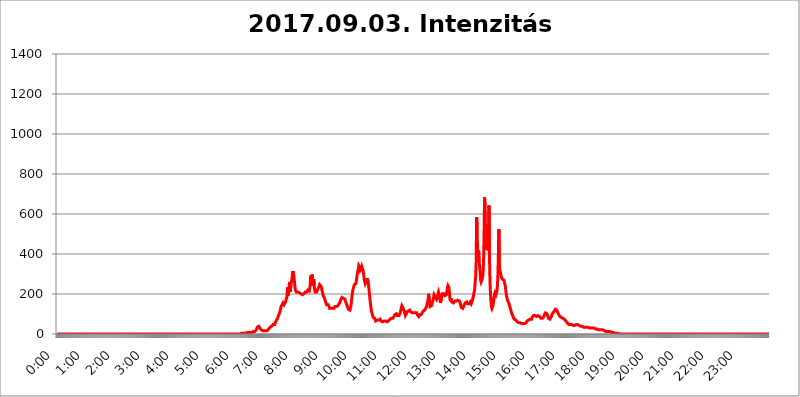
| Category | 2017.09.03. Intenzitás [W/m^2] |
|---|---|
| 0.0 | 0 |
| 0.0006944444444444445 | 0 |
| 0.001388888888888889 | 0 |
| 0.0020833333333333333 | 0 |
| 0.002777777777777778 | 0 |
| 0.003472222222222222 | 0 |
| 0.004166666666666667 | 0 |
| 0.004861111111111111 | 0 |
| 0.005555555555555556 | 0 |
| 0.0062499999999999995 | 0 |
| 0.006944444444444444 | 0 |
| 0.007638888888888889 | 0 |
| 0.008333333333333333 | 0 |
| 0.009027777777777779 | 0 |
| 0.009722222222222222 | 0 |
| 0.010416666666666666 | 0 |
| 0.011111111111111112 | 0 |
| 0.011805555555555555 | 0 |
| 0.012499999999999999 | 0 |
| 0.013194444444444444 | 0 |
| 0.013888888888888888 | 0 |
| 0.014583333333333332 | 0 |
| 0.015277777777777777 | 0 |
| 0.015972222222222224 | 0 |
| 0.016666666666666666 | 0 |
| 0.017361111111111112 | 0 |
| 0.018055555555555557 | 0 |
| 0.01875 | 0 |
| 0.019444444444444445 | 0 |
| 0.02013888888888889 | 0 |
| 0.020833333333333332 | 0 |
| 0.02152777777777778 | 0 |
| 0.022222222222222223 | 0 |
| 0.02291666666666667 | 0 |
| 0.02361111111111111 | 0 |
| 0.024305555555555556 | 0 |
| 0.024999999999999998 | 0 |
| 0.025694444444444447 | 0 |
| 0.02638888888888889 | 0 |
| 0.027083333333333334 | 0 |
| 0.027777777777777776 | 0 |
| 0.02847222222222222 | 0 |
| 0.029166666666666664 | 0 |
| 0.029861111111111113 | 0 |
| 0.030555555555555555 | 0 |
| 0.03125 | 0 |
| 0.03194444444444445 | 0 |
| 0.03263888888888889 | 0 |
| 0.03333333333333333 | 0 |
| 0.034027777777777775 | 0 |
| 0.034722222222222224 | 0 |
| 0.035416666666666666 | 0 |
| 0.036111111111111115 | 0 |
| 0.03680555555555556 | 0 |
| 0.0375 | 0 |
| 0.03819444444444444 | 0 |
| 0.03888888888888889 | 0 |
| 0.03958333333333333 | 0 |
| 0.04027777777777778 | 0 |
| 0.04097222222222222 | 0 |
| 0.041666666666666664 | 0 |
| 0.042361111111111106 | 0 |
| 0.04305555555555556 | 0 |
| 0.043750000000000004 | 0 |
| 0.044444444444444446 | 0 |
| 0.04513888888888889 | 0 |
| 0.04583333333333334 | 0 |
| 0.04652777777777778 | 0 |
| 0.04722222222222222 | 0 |
| 0.04791666666666666 | 0 |
| 0.04861111111111111 | 0 |
| 0.049305555555555554 | 0 |
| 0.049999999999999996 | 0 |
| 0.05069444444444445 | 0 |
| 0.051388888888888894 | 0 |
| 0.052083333333333336 | 0 |
| 0.05277777777777778 | 0 |
| 0.05347222222222222 | 0 |
| 0.05416666666666667 | 0 |
| 0.05486111111111111 | 0 |
| 0.05555555555555555 | 0 |
| 0.05625 | 0 |
| 0.05694444444444444 | 0 |
| 0.057638888888888885 | 0 |
| 0.05833333333333333 | 0 |
| 0.05902777777777778 | 0 |
| 0.059722222222222225 | 0 |
| 0.06041666666666667 | 0 |
| 0.061111111111111116 | 0 |
| 0.06180555555555556 | 0 |
| 0.0625 | 0 |
| 0.06319444444444444 | 0 |
| 0.06388888888888888 | 0 |
| 0.06458333333333334 | 0 |
| 0.06527777777777778 | 0 |
| 0.06597222222222222 | 0 |
| 0.06666666666666667 | 0 |
| 0.06736111111111111 | 0 |
| 0.06805555555555555 | 0 |
| 0.06874999999999999 | 0 |
| 0.06944444444444443 | 0 |
| 0.07013888888888889 | 0 |
| 0.07083333333333333 | 0 |
| 0.07152777777777779 | 0 |
| 0.07222222222222223 | 0 |
| 0.07291666666666667 | 0 |
| 0.07361111111111111 | 0 |
| 0.07430555555555556 | 0 |
| 0.075 | 0 |
| 0.07569444444444444 | 0 |
| 0.0763888888888889 | 0 |
| 0.07708333333333334 | 0 |
| 0.07777777777777778 | 0 |
| 0.07847222222222222 | 0 |
| 0.07916666666666666 | 0 |
| 0.0798611111111111 | 0 |
| 0.08055555555555556 | 0 |
| 0.08125 | 0 |
| 0.08194444444444444 | 0 |
| 0.08263888888888889 | 0 |
| 0.08333333333333333 | 0 |
| 0.08402777777777777 | 0 |
| 0.08472222222222221 | 0 |
| 0.08541666666666665 | 0 |
| 0.08611111111111112 | 0 |
| 0.08680555555555557 | 0 |
| 0.08750000000000001 | 0 |
| 0.08819444444444445 | 0 |
| 0.08888888888888889 | 0 |
| 0.08958333333333333 | 0 |
| 0.09027777777777778 | 0 |
| 0.09097222222222222 | 0 |
| 0.09166666666666667 | 0 |
| 0.09236111111111112 | 0 |
| 0.09305555555555556 | 0 |
| 0.09375 | 0 |
| 0.09444444444444444 | 0 |
| 0.09513888888888888 | 0 |
| 0.09583333333333333 | 0 |
| 0.09652777777777777 | 0 |
| 0.09722222222222222 | 0 |
| 0.09791666666666667 | 0 |
| 0.09861111111111111 | 0 |
| 0.09930555555555555 | 0 |
| 0.09999999999999999 | 0 |
| 0.10069444444444443 | 0 |
| 0.1013888888888889 | 0 |
| 0.10208333333333335 | 0 |
| 0.10277777777777779 | 0 |
| 0.10347222222222223 | 0 |
| 0.10416666666666667 | 0 |
| 0.10486111111111111 | 0 |
| 0.10555555555555556 | 0 |
| 0.10625 | 0 |
| 0.10694444444444444 | 0 |
| 0.1076388888888889 | 0 |
| 0.10833333333333334 | 0 |
| 0.10902777777777778 | 0 |
| 0.10972222222222222 | 0 |
| 0.1111111111111111 | 0 |
| 0.11180555555555556 | 0 |
| 0.11180555555555556 | 0 |
| 0.1125 | 0 |
| 0.11319444444444444 | 0 |
| 0.11388888888888889 | 0 |
| 0.11458333333333333 | 0 |
| 0.11527777777777777 | 0 |
| 0.11597222222222221 | 0 |
| 0.11666666666666665 | 0 |
| 0.1173611111111111 | 0 |
| 0.11805555555555557 | 0 |
| 0.11944444444444445 | 0 |
| 0.12013888888888889 | 0 |
| 0.12083333333333333 | 0 |
| 0.12152777777777778 | 0 |
| 0.12222222222222223 | 0 |
| 0.12291666666666667 | 0 |
| 0.12291666666666667 | 0 |
| 0.12361111111111112 | 0 |
| 0.12430555555555556 | 0 |
| 0.125 | 0 |
| 0.12569444444444444 | 0 |
| 0.12638888888888888 | 0 |
| 0.12708333333333333 | 0 |
| 0.16875 | 0 |
| 0.12847222222222224 | 0 |
| 0.12916666666666668 | 0 |
| 0.12986111111111112 | 0 |
| 0.13055555555555556 | 0 |
| 0.13125 | 0 |
| 0.13194444444444445 | 0 |
| 0.1326388888888889 | 0 |
| 0.13333333333333333 | 0 |
| 0.13402777777777777 | 0 |
| 0.13402777777777777 | 0 |
| 0.13472222222222222 | 0 |
| 0.13541666666666666 | 0 |
| 0.1361111111111111 | 0 |
| 0.13749999999999998 | 0 |
| 0.13819444444444443 | 0 |
| 0.1388888888888889 | 0 |
| 0.13958333333333334 | 0 |
| 0.14027777777777778 | 0 |
| 0.14097222222222222 | 0 |
| 0.14166666666666666 | 0 |
| 0.1423611111111111 | 0 |
| 0.14305555555555557 | 0 |
| 0.14375000000000002 | 0 |
| 0.14444444444444446 | 0 |
| 0.1451388888888889 | 0 |
| 0.1451388888888889 | 0 |
| 0.14652777777777778 | 0 |
| 0.14722222222222223 | 0 |
| 0.14791666666666667 | 0 |
| 0.1486111111111111 | 0 |
| 0.14930555555555555 | 0 |
| 0.15 | 0 |
| 0.15069444444444444 | 0 |
| 0.15138888888888888 | 0 |
| 0.15208333333333332 | 0 |
| 0.15277777777777776 | 0 |
| 0.15347222222222223 | 0 |
| 0.15416666666666667 | 0 |
| 0.15486111111111112 | 0 |
| 0.15555555555555556 | 0 |
| 0.15625 | 0 |
| 0.15694444444444444 | 0 |
| 0.15763888888888888 | 0 |
| 0.15833333333333333 | 0 |
| 0.15902777777777777 | 0 |
| 0.15972222222222224 | 0 |
| 0.16041666666666668 | 0 |
| 0.16111111111111112 | 0 |
| 0.16180555555555556 | 0 |
| 0.1625 | 0 |
| 0.16319444444444445 | 0 |
| 0.1638888888888889 | 0 |
| 0.16458333333333333 | 0 |
| 0.16527777777777777 | 0 |
| 0.16597222222222222 | 0 |
| 0.16666666666666666 | 0 |
| 0.1673611111111111 | 0 |
| 0.16805555555555554 | 0 |
| 0.16874999999999998 | 0 |
| 0.16944444444444443 | 0 |
| 0.17013888888888887 | 0 |
| 0.1708333333333333 | 0 |
| 0.17152777777777775 | 0 |
| 0.17222222222222225 | 0 |
| 0.1729166666666667 | 0 |
| 0.17361111111111113 | 0 |
| 0.17430555555555557 | 0 |
| 0.17500000000000002 | 0 |
| 0.17569444444444446 | 0 |
| 0.1763888888888889 | 0 |
| 0.17708333333333334 | 0 |
| 0.17777777777777778 | 0 |
| 0.17847222222222223 | 0 |
| 0.17916666666666667 | 0 |
| 0.1798611111111111 | 0 |
| 0.18055555555555555 | 0 |
| 0.18125 | 0 |
| 0.18194444444444444 | 0 |
| 0.1826388888888889 | 0 |
| 0.18333333333333335 | 0 |
| 0.1840277777777778 | 0 |
| 0.18472222222222223 | 0 |
| 0.18541666666666667 | 0 |
| 0.18611111111111112 | 0 |
| 0.18680555555555556 | 0 |
| 0.1875 | 0 |
| 0.18819444444444444 | 0 |
| 0.18888888888888888 | 0 |
| 0.18958333333333333 | 0 |
| 0.19027777777777777 | 0 |
| 0.1909722222222222 | 0 |
| 0.19166666666666665 | 0 |
| 0.19236111111111112 | 0 |
| 0.19305555555555554 | 0 |
| 0.19375 | 0 |
| 0.19444444444444445 | 0 |
| 0.1951388888888889 | 0 |
| 0.19583333333333333 | 0 |
| 0.19652777777777777 | 0 |
| 0.19722222222222222 | 0 |
| 0.19791666666666666 | 0 |
| 0.1986111111111111 | 0 |
| 0.19930555555555554 | 0 |
| 0.19999999999999998 | 0 |
| 0.20069444444444443 | 0 |
| 0.20138888888888887 | 0 |
| 0.2020833333333333 | 0 |
| 0.2027777777777778 | 0 |
| 0.2034722222222222 | 0 |
| 0.2041666666666667 | 0 |
| 0.20486111111111113 | 0 |
| 0.20555555555555557 | 0 |
| 0.20625000000000002 | 0 |
| 0.20694444444444446 | 0 |
| 0.2076388888888889 | 0 |
| 0.20833333333333334 | 0 |
| 0.20902777777777778 | 0 |
| 0.20972222222222223 | 0 |
| 0.21041666666666667 | 0 |
| 0.2111111111111111 | 0 |
| 0.21180555555555555 | 0 |
| 0.2125 | 0 |
| 0.21319444444444444 | 0 |
| 0.2138888888888889 | 0 |
| 0.21458333333333335 | 0 |
| 0.2152777777777778 | 0 |
| 0.21597222222222223 | 0 |
| 0.21666666666666667 | 0 |
| 0.21736111111111112 | 0 |
| 0.21805555555555556 | 0 |
| 0.21875 | 0 |
| 0.21944444444444444 | 0 |
| 0.22013888888888888 | 0 |
| 0.22083333333333333 | 0 |
| 0.22152777777777777 | 0 |
| 0.2222222222222222 | 0 |
| 0.22291666666666665 | 0 |
| 0.2236111111111111 | 0 |
| 0.22430555555555556 | 0 |
| 0.225 | 0 |
| 0.22569444444444445 | 0 |
| 0.2263888888888889 | 0 |
| 0.22708333333333333 | 0 |
| 0.22777777777777777 | 0 |
| 0.22847222222222222 | 0 |
| 0.22916666666666666 | 0 |
| 0.2298611111111111 | 0 |
| 0.23055555555555554 | 0 |
| 0.23124999999999998 | 0 |
| 0.23194444444444443 | 0 |
| 0.23263888888888887 | 0 |
| 0.2333333333333333 | 0 |
| 0.2340277777777778 | 0 |
| 0.2347222222222222 | 0 |
| 0.2354166666666667 | 0 |
| 0.23611111111111113 | 0 |
| 0.23680555555555557 | 0 |
| 0.23750000000000002 | 0 |
| 0.23819444444444446 | 0 |
| 0.2388888888888889 | 0 |
| 0.23958333333333334 | 0 |
| 0.24027777777777778 | 0 |
| 0.24097222222222223 | 0 |
| 0.24166666666666667 | 0 |
| 0.2423611111111111 | 0 |
| 0.24305555555555555 | 0 |
| 0.24375 | 0 |
| 0.24444444444444446 | 0 |
| 0.24513888888888888 | 0 |
| 0.24583333333333335 | 0 |
| 0.2465277777777778 | 0 |
| 0.24722222222222223 | 0 |
| 0.24791666666666667 | 0 |
| 0.24861111111111112 | 0 |
| 0.24930555555555556 | 0 |
| 0.25 | 0 |
| 0.25069444444444444 | 0 |
| 0.2513888888888889 | 0 |
| 0.2520833333333333 | 0 |
| 0.25277777777777777 | 0 |
| 0.2534722222222222 | 0 |
| 0.25416666666666665 | 0 |
| 0.2548611111111111 | 0 |
| 0.2555555555555556 | 3.525 |
| 0.25625000000000003 | 0 |
| 0.2569444444444445 | 3.525 |
| 0.2576388888888889 | 0 |
| 0.25833333333333336 | 3.525 |
| 0.2590277777777778 | 3.525 |
| 0.25972222222222224 | 3.525 |
| 0.2604166666666667 | 3.525 |
| 0.2611111111111111 | 3.525 |
| 0.26180555555555557 | 3.525 |
| 0.2625 | 3.525 |
| 0.26319444444444445 | 3.525 |
| 0.2638888888888889 | 3.525 |
| 0.26458333333333334 | 3.525 |
| 0.2652777777777778 | 7.887 |
| 0.2659722222222222 | 7.887 |
| 0.26666666666666666 | 7.887 |
| 0.2673611111111111 | 7.887 |
| 0.26805555555555555 | 7.887 |
| 0.26875 | 7.887 |
| 0.26944444444444443 | 7.887 |
| 0.2701388888888889 | 7.887 |
| 0.2708333333333333 | 7.887 |
| 0.27152777777777776 | 7.887 |
| 0.2722222222222222 | 7.887 |
| 0.27291666666666664 | 7.887 |
| 0.2736111111111111 | 7.887 |
| 0.2743055555555555 | 12.257 |
| 0.27499999999999997 | 12.257 |
| 0.27569444444444446 | 12.257 |
| 0.27638888888888885 | 12.257 |
| 0.27708333333333335 | 12.257 |
| 0.2777777777777778 | 12.257 |
| 0.27847222222222223 | 16.636 |
| 0.2791666666666667 | 21.024 |
| 0.2798611111111111 | 25.419 |
| 0.28055555555555556 | 34.234 |
| 0.28125 | 38.653 |
| 0.28194444444444444 | 38.653 |
| 0.2826388888888889 | 38.653 |
| 0.2833333333333333 | 34.234 |
| 0.28402777777777777 | 29.823 |
| 0.2847222222222222 | 29.823 |
| 0.28541666666666665 | 25.419 |
| 0.28611111111111115 | 21.024 |
| 0.28680555555555554 | 21.024 |
| 0.28750000000000003 | 16.636 |
| 0.2881944444444445 | 16.636 |
| 0.2888888888888889 | 12.257 |
| 0.28958333333333336 | 12.257 |
| 0.2902777777777778 | 16.636 |
| 0.29097222222222224 | 16.636 |
| 0.2916666666666667 | 16.636 |
| 0.2923611111111111 | 16.636 |
| 0.29305555555555557 | 16.636 |
| 0.29375 | 16.636 |
| 0.29444444444444445 | 16.636 |
| 0.2951388888888889 | 21.024 |
| 0.29583333333333334 | 21.024 |
| 0.2965277777777778 | 25.419 |
| 0.2972222222222222 | 25.419 |
| 0.29791666666666666 | 29.823 |
| 0.2986111111111111 | 34.234 |
| 0.29930555555555555 | 38.653 |
| 0.3 | 38.653 |
| 0.30069444444444443 | 38.653 |
| 0.3013888888888889 | 38.653 |
| 0.3020833333333333 | 43.079 |
| 0.30277777777777776 | 47.511 |
| 0.3034722222222222 | 43.079 |
| 0.30416666666666664 | 43.079 |
| 0.3048611111111111 | 47.511 |
| 0.3055555555555555 | 51.951 |
| 0.30624999999999997 | 60.85 |
| 0.3069444444444444 | 65.31 |
| 0.3076388888888889 | 69.775 |
| 0.30833333333333335 | 74.246 |
| 0.3090277777777778 | 78.722 |
| 0.30972222222222223 | 83.205 |
| 0.3104166666666667 | 92.184 |
| 0.3111111111111111 | 96.682 |
| 0.31180555555555556 | 105.69 |
| 0.3125 | 114.716 |
| 0.31319444444444444 | 123.758 |
| 0.3138888888888889 | 137.347 |
| 0.3145833333333333 | 141.884 |
| 0.31527777777777777 | 146.423 |
| 0.3159722222222222 | 146.423 |
| 0.31666666666666665 | 155.509 |
| 0.31736111111111115 | 155.509 |
| 0.31805555555555554 | 146.423 |
| 0.31875000000000003 | 146.423 |
| 0.3194444444444445 | 150.964 |
| 0.3201388888888889 | 160.056 |
| 0.32083333333333336 | 169.156 |
| 0.3215277777777778 | 178.264 |
| 0.32222222222222224 | 187.378 |
| 0.3229166666666667 | 233 |
| 0.3236111111111111 | 191.937 |
| 0.32430555555555557 | 201.058 |
| 0.325 | 228.436 |
| 0.32569444444444445 | 260.373 |
| 0.3263888888888889 | 210.182 |
| 0.32708333333333334 | 210.182 |
| 0.3277777777777778 | 246.689 |
| 0.3284722222222222 | 242.127 |
| 0.32916666666666666 | 274.047 |
| 0.3298611111111111 | 301.354 |
| 0.33055555555555555 | 314.98 |
| 0.33125 | 319.517 |
| 0.33194444444444443 | 287.709 |
| 0.3326388888888889 | 264.932 |
| 0.3333333333333333 | 237.564 |
| 0.3340277777777778 | 219.309 |
| 0.3347222222222222 | 219.309 |
| 0.3354166666666667 | 210.182 |
| 0.3361111111111111 | 210.182 |
| 0.3368055555555556 | 214.746 |
| 0.33749999999999997 | 210.182 |
| 0.33819444444444446 | 210.182 |
| 0.33888888888888885 | 210.182 |
| 0.33958333333333335 | 205.62 |
| 0.34027777777777773 | 205.62 |
| 0.34097222222222223 | 205.62 |
| 0.3416666666666666 | 201.058 |
| 0.3423611111111111 | 205.62 |
| 0.3430555555555555 | 201.058 |
| 0.34375 | 196.497 |
| 0.3444444444444445 | 191.937 |
| 0.3451388888888889 | 191.937 |
| 0.3458333333333334 | 201.058 |
| 0.34652777777777777 | 205.62 |
| 0.34722222222222227 | 205.62 |
| 0.34791666666666665 | 210.182 |
| 0.34861111111111115 | 205.62 |
| 0.34930555555555554 | 210.182 |
| 0.35000000000000003 | 210.182 |
| 0.3506944444444444 | 214.746 |
| 0.3513888888888889 | 219.309 |
| 0.3520833333333333 | 219.309 |
| 0.3527777777777778 | 214.746 |
| 0.3534722222222222 | 214.746 |
| 0.3541666666666667 | 219.309 |
| 0.3548611111111111 | 246.689 |
| 0.35555555555555557 | 292.259 |
| 0.35625 | 269.49 |
| 0.35694444444444445 | 255.813 |
| 0.3576388888888889 | 296.808 |
| 0.35833333333333334 | 242.127 |
| 0.3590277777777778 | 264.932 |
| 0.3597222222222222 | 274.047 |
| 0.36041666666666666 | 242.127 |
| 0.3611111111111111 | 219.309 |
| 0.36180555555555555 | 210.182 |
| 0.3625 | 210.182 |
| 0.36319444444444443 | 210.182 |
| 0.3638888888888889 | 210.182 |
| 0.3645833333333333 | 219.309 |
| 0.3652777777777778 | 223.873 |
| 0.3659722222222222 | 228.436 |
| 0.3666666666666667 | 233 |
| 0.3673611111111111 | 237.564 |
| 0.3680555555555556 | 246.689 |
| 0.36874999999999997 | 251.251 |
| 0.36944444444444446 | 251.251 |
| 0.37013888888888885 | 237.564 |
| 0.37083333333333335 | 228.436 |
| 0.37152777777777773 | 214.746 |
| 0.37222222222222223 | 205.62 |
| 0.3729166666666666 | 191.937 |
| 0.3736111111111111 | 187.378 |
| 0.3743055555555555 | 182.82 |
| 0.375 | 178.264 |
| 0.3756944444444445 | 169.156 |
| 0.3763888888888889 | 160.056 |
| 0.3770833333333334 | 155.509 |
| 0.37777777777777777 | 146.423 |
| 0.37847222222222227 | 146.423 |
| 0.37916666666666665 | 146.423 |
| 0.37986111111111115 | 146.423 |
| 0.38055555555555554 | 141.884 |
| 0.38125000000000003 | 137.347 |
| 0.3819444444444444 | 128.284 |
| 0.3826388888888889 | 123.758 |
| 0.3833333333333333 | 123.758 |
| 0.3840277777777778 | 128.284 |
| 0.3847222222222222 | 128.284 |
| 0.3854166666666667 | 128.284 |
| 0.3861111111111111 | 128.284 |
| 0.38680555555555557 | 123.758 |
| 0.3875 | 128.284 |
| 0.38819444444444445 | 128.284 |
| 0.3888888888888889 | 132.814 |
| 0.38958333333333334 | 137.347 |
| 0.3902777777777778 | 137.347 |
| 0.3909722222222222 | 137.347 |
| 0.39166666666666666 | 137.347 |
| 0.3923611111111111 | 137.347 |
| 0.39305555555555555 | 141.884 |
| 0.39375 | 141.884 |
| 0.39444444444444443 | 146.423 |
| 0.3951388888888889 | 150.964 |
| 0.3958333333333333 | 155.509 |
| 0.3965277777777778 | 160.056 |
| 0.3972222222222222 | 164.605 |
| 0.3979166666666667 | 173.709 |
| 0.3986111111111111 | 178.264 |
| 0.3993055555555556 | 182.82 |
| 0.39999999999999997 | 182.82 |
| 0.40069444444444446 | 182.82 |
| 0.40138888888888885 | 178.264 |
| 0.40208333333333335 | 178.264 |
| 0.40277777777777773 | 173.709 |
| 0.40347222222222223 | 173.709 |
| 0.4041666666666666 | 164.605 |
| 0.4048611111111111 | 160.056 |
| 0.4055555555555555 | 150.964 |
| 0.40625 | 146.423 |
| 0.4069444444444445 | 137.347 |
| 0.4076388888888889 | 132.814 |
| 0.4083333333333334 | 123.758 |
| 0.40902777777777777 | 119.235 |
| 0.40972222222222227 | 119.235 |
| 0.41041666666666665 | 119.235 |
| 0.41111111111111115 | 123.758 |
| 0.41180555555555554 | 137.347 |
| 0.41250000000000003 | 160.056 |
| 0.4131944444444444 | 182.82 |
| 0.4138888888888889 | 201.058 |
| 0.4145833333333333 | 219.309 |
| 0.4152777777777778 | 228.436 |
| 0.4159722222222222 | 237.564 |
| 0.4166666666666667 | 246.689 |
| 0.4173611111111111 | 246.689 |
| 0.41805555555555557 | 246.689 |
| 0.41875 | 251.251 |
| 0.41944444444444445 | 264.932 |
| 0.4201388888888889 | 283.156 |
| 0.42083333333333334 | 301.354 |
| 0.4215277777777778 | 314.98 |
| 0.4222222222222222 | 324.052 |
| 0.42291666666666666 | 342.162 |
| 0.4236111111111111 | 346.682 |
| 0.42430555555555555 | 333.113 |
| 0.425 | 319.517 |
| 0.42569444444444443 | 324.052 |
| 0.4263888888888889 | 328.584 |
| 0.4270833333333333 | 337.639 |
| 0.4277777777777778 | 337.639 |
| 0.4284722222222222 | 333.113 |
| 0.4291666666666667 | 314.98 |
| 0.4298611111111111 | 319.517 |
| 0.4305555555555556 | 274.047 |
| 0.43124999999999997 | 260.373 |
| 0.43194444444444446 | 251.251 |
| 0.43263888888888885 | 251.251 |
| 0.43333333333333335 | 255.813 |
| 0.43402777777777773 | 269.49 |
| 0.43472222222222223 | 278.603 |
| 0.4354166666666666 | 274.047 |
| 0.4361111111111111 | 255.813 |
| 0.4368055555555555 | 237.564 |
| 0.4375 | 214.746 |
| 0.4381944444444445 | 187.378 |
| 0.4388888888888889 | 164.605 |
| 0.4395833333333334 | 141.884 |
| 0.44027777777777777 | 123.758 |
| 0.44097222222222227 | 110.201 |
| 0.44166666666666665 | 101.184 |
| 0.44236111111111115 | 92.184 |
| 0.44305555555555554 | 83.205 |
| 0.44375000000000003 | 83.205 |
| 0.4444444444444444 | 83.205 |
| 0.4451388888888889 | 78.722 |
| 0.4458333333333333 | 74.246 |
| 0.4465277777777778 | 65.31 |
| 0.4472222222222222 | 65.31 |
| 0.4479166666666667 | 69.775 |
| 0.4486111111111111 | 69.775 |
| 0.44930555555555557 | 65.31 |
| 0.45 | 65.31 |
| 0.45069444444444445 | 69.775 |
| 0.4513888888888889 | 65.31 |
| 0.45208333333333334 | 65.31 |
| 0.4527777777777778 | 74.246 |
| 0.4534722222222222 | 69.775 |
| 0.45416666666666666 | 65.31 |
| 0.4548611111111111 | 65.31 |
| 0.45555555555555555 | 60.85 |
| 0.45625 | 60.85 |
| 0.45694444444444443 | 65.31 |
| 0.4576388888888889 | 65.31 |
| 0.4583333333333333 | 65.31 |
| 0.4590277777777778 | 65.31 |
| 0.4597222222222222 | 65.31 |
| 0.4604166666666667 | 65.31 |
| 0.4611111111111111 | 60.85 |
| 0.4618055555555556 | 60.85 |
| 0.46249999999999997 | 60.85 |
| 0.46319444444444446 | 60.85 |
| 0.46388888888888885 | 60.85 |
| 0.46458333333333335 | 65.31 |
| 0.46527777777777773 | 65.31 |
| 0.46597222222222223 | 69.775 |
| 0.4666666666666666 | 74.246 |
| 0.4673611111111111 | 74.246 |
| 0.4680555555555555 | 78.722 |
| 0.46875 | 78.722 |
| 0.4694444444444445 | 78.722 |
| 0.4701388888888889 | 78.722 |
| 0.4708333333333334 | 78.722 |
| 0.47152777777777777 | 83.205 |
| 0.47222222222222227 | 87.692 |
| 0.47291666666666665 | 92.184 |
| 0.47361111111111115 | 96.682 |
| 0.47430555555555554 | 101.184 |
| 0.47500000000000003 | 101.184 |
| 0.4756944444444444 | 101.184 |
| 0.4763888888888889 | 96.682 |
| 0.4770833333333333 | 92.184 |
| 0.4777777777777778 | 87.692 |
| 0.4784722222222222 | 87.692 |
| 0.4791666666666667 | 92.184 |
| 0.4798611111111111 | 92.184 |
| 0.48055555555555557 | 101.184 |
| 0.48125 | 110.201 |
| 0.48194444444444445 | 119.235 |
| 0.4826388888888889 | 132.814 |
| 0.48333333333333334 | 141.884 |
| 0.4840277777777778 | 137.347 |
| 0.4847222222222222 | 132.814 |
| 0.48541666666666666 | 128.284 |
| 0.4861111111111111 | 128.284 |
| 0.48680555555555555 | 114.716 |
| 0.4875 | 101.184 |
| 0.48819444444444443 | 92.184 |
| 0.4888888888888889 | 92.184 |
| 0.4895833333333333 | 101.184 |
| 0.4902777777777778 | 110.201 |
| 0.4909722222222222 | 114.716 |
| 0.4916666666666667 | 114.716 |
| 0.4923611111111111 | 114.716 |
| 0.4930555555555556 | 119.235 |
| 0.49374999999999997 | 119.235 |
| 0.49444444444444446 | 119.235 |
| 0.49513888888888885 | 114.716 |
| 0.49583333333333335 | 110.201 |
| 0.49652777777777773 | 110.201 |
| 0.49722222222222223 | 105.69 |
| 0.4979166666666666 | 105.69 |
| 0.4986111111111111 | 110.201 |
| 0.4993055555555555 | 105.69 |
| 0.5 | 105.69 |
| 0.5006944444444444 | 105.69 |
| 0.5013888888888889 | 105.69 |
| 0.5020833333333333 | 105.69 |
| 0.5027777777777778 | 105.69 |
| 0.5034722222222222 | 105.69 |
| 0.5041666666666667 | 105.69 |
| 0.5048611111111111 | 96.682 |
| 0.5055555555555555 | 96.682 |
| 0.50625 | 92.184 |
| 0.5069444444444444 | 87.692 |
| 0.5076388888888889 | 92.184 |
| 0.5083333333333333 | 96.682 |
| 0.5090277777777777 | 96.682 |
| 0.5097222222222222 | 96.682 |
| 0.5104166666666666 | 96.682 |
| 0.5111111111111112 | 101.184 |
| 0.5118055555555555 | 105.69 |
| 0.5125000000000001 | 110.201 |
| 0.5131944444444444 | 114.716 |
| 0.513888888888889 | 119.235 |
| 0.5145833333333333 | 119.235 |
| 0.5152777777777778 | 119.235 |
| 0.5159722222222222 | 123.758 |
| 0.5166666666666667 | 128.284 |
| 0.517361111111111 | 132.814 |
| 0.5180555555555556 | 137.347 |
| 0.5187499999999999 | 150.964 |
| 0.5194444444444445 | 160.056 |
| 0.5201388888888888 | 173.709 |
| 0.5208333333333334 | 201.058 |
| 0.5215277777777778 | 201.058 |
| 0.5222222222222223 | 160.056 |
| 0.5229166666666667 | 137.347 |
| 0.5236111111111111 | 132.814 |
| 0.5243055555555556 | 132.814 |
| 0.525 | 141.884 |
| 0.5256944444444445 | 150.964 |
| 0.5263888888888889 | 155.509 |
| 0.5270833333333333 | 169.156 |
| 0.5277777777777778 | 182.82 |
| 0.5284722222222222 | 196.497 |
| 0.5291666666666667 | 201.058 |
| 0.5298611111111111 | 196.497 |
| 0.5305555555555556 | 182.82 |
| 0.53125 | 178.264 |
| 0.5319444444444444 | 173.709 |
| 0.5326388888888889 | 178.264 |
| 0.5333333333333333 | 187.378 |
| 0.5340277777777778 | 201.058 |
| 0.5347222222222222 | 210.182 |
| 0.5354166666666667 | 205.62 |
| 0.5361111111111111 | 191.937 |
| 0.5368055555555555 | 169.156 |
| 0.5375 | 155.509 |
| 0.5381944444444444 | 160.056 |
| 0.5388888888888889 | 178.264 |
| 0.5395833333333333 | 191.937 |
| 0.5402777777777777 | 201.058 |
| 0.5409722222222222 | 201.058 |
| 0.5416666666666666 | 201.058 |
| 0.5423611111111112 | 201.058 |
| 0.5430555555555555 | 201.058 |
| 0.5437500000000001 | 191.937 |
| 0.5444444444444444 | 187.378 |
| 0.545138888888889 | 187.378 |
| 0.5458333333333333 | 196.497 |
| 0.5465277777777778 | 214.746 |
| 0.5472222222222222 | 233 |
| 0.5479166666666667 | 242.127 |
| 0.548611111111111 | 242.127 |
| 0.5493055555555556 | 233 |
| 0.5499999999999999 | 210.182 |
| 0.5506944444444445 | 178.264 |
| 0.5513888888888888 | 164.605 |
| 0.5520833333333334 | 178.264 |
| 0.5527777777777778 | 178.264 |
| 0.5534722222222223 | 160.056 |
| 0.5541666666666667 | 155.509 |
| 0.5548611111111111 | 155.509 |
| 0.5555555555555556 | 155.509 |
| 0.55625 | 155.509 |
| 0.5569444444444445 | 160.056 |
| 0.5576388888888889 | 164.605 |
| 0.5583333333333333 | 164.605 |
| 0.5590277777777778 | 164.605 |
| 0.5597222222222222 | 164.605 |
| 0.5604166666666667 | 164.605 |
| 0.5611111111111111 | 164.605 |
| 0.5618055555555556 | 169.156 |
| 0.5625 | 173.709 |
| 0.5631944444444444 | 169.156 |
| 0.5638888888888889 | 164.605 |
| 0.5645833333333333 | 164.605 |
| 0.5652777777777778 | 155.509 |
| 0.5659722222222222 | 141.884 |
| 0.5666666666666667 | 132.814 |
| 0.5673611111111111 | 128.284 |
| 0.5680555555555555 | 128.284 |
| 0.56875 | 128.284 |
| 0.5694444444444444 | 132.814 |
| 0.5701388888888889 | 137.347 |
| 0.5708333333333333 | 146.423 |
| 0.5715277777777777 | 150.964 |
| 0.5722222222222222 | 155.509 |
| 0.5729166666666666 | 160.056 |
| 0.5736111111111112 | 160.056 |
| 0.5743055555555555 | 160.056 |
| 0.5750000000000001 | 155.509 |
| 0.5756944444444444 | 150.964 |
| 0.576388888888889 | 146.423 |
| 0.5770833333333333 | 146.423 |
| 0.5777777777777778 | 150.964 |
| 0.5784722222222222 | 155.509 |
| 0.5791666666666667 | 160.056 |
| 0.579861111111111 | 155.509 |
| 0.5805555555555556 | 150.964 |
| 0.5812499999999999 | 155.509 |
| 0.5819444444444445 | 164.605 |
| 0.5826388888888888 | 173.709 |
| 0.5833333333333334 | 182.82 |
| 0.5840277777777778 | 196.497 |
| 0.5847222222222223 | 210.182 |
| 0.5854166666666667 | 223.873 |
| 0.5861111111111111 | 255.813 |
| 0.5868055555555556 | 287.709 |
| 0.5875 | 355.712 |
| 0.5881944444444445 | 583.779 |
| 0.5888888888888889 | 532.513 |
| 0.5895833333333333 | 391.685 |
| 0.5902777777777778 | 382.715 |
| 0.5909722222222222 | 418.492 |
| 0.5916666666666667 | 360.221 |
| 0.5923611111111111 | 342.162 |
| 0.5930555555555556 | 310.44 |
| 0.59375 | 269.49 |
| 0.5944444444444444 | 260.373 |
| 0.5951388888888889 | 264.932 |
| 0.5958333333333333 | 274.047 |
| 0.5965277777777778 | 283.156 |
| 0.5972222222222222 | 305.898 |
| 0.5979166666666667 | 360.221 |
| 0.5986111111111111 | 489.108 |
| 0.5993055555555555 | 683.473 |
| 0.6 | 638.256 |
| 0.6006944444444444 | 497.836 |
| 0.6013888888888889 | 440.702 |
| 0.6020833333333333 | 422.943 |
| 0.6027777777777777 | 427.39 |
| 0.6034722222222222 | 549.704 |
| 0.6041666666666666 | 418.492 |
| 0.6048611111111112 | 528.2 |
| 0.6055555555555555 | 642.4 |
| 0.6062500000000001 | 378.224 |
| 0.6069444444444444 | 260.373 |
| 0.607638888888889 | 201.058 |
| 0.6083333333333333 | 160.056 |
| 0.6090277777777778 | 137.347 |
| 0.6097222222222222 | 128.284 |
| 0.6104166666666667 | 132.814 |
| 0.611111111111111 | 141.884 |
| 0.6118055555555556 | 160.056 |
| 0.6124999999999999 | 178.264 |
| 0.6131944444444445 | 196.497 |
| 0.6138888888888888 | 205.62 |
| 0.6145833333333334 | 210.182 |
| 0.6152777777777778 | 196.497 |
| 0.6159722222222223 | 201.058 |
| 0.6166666666666667 | 214.746 |
| 0.6173611111111111 | 242.127 |
| 0.6180555555555556 | 296.808 |
| 0.61875 | 405.108 |
| 0.6194444444444445 | 523.88 |
| 0.6201388888888889 | 333.113 |
| 0.6208333333333333 | 319.517 |
| 0.6215277777777778 | 305.898 |
| 0.6222222222222222 | 296.808 |
| 0.6229166666666667 | 283.156 |
| 0.6236111111111111 | 278.603 |
| 0.6243055555555556 | 274.047 |
| 0.625 | 269.49 |
| 0.6256944444444444 | 269.49 |
| 0.6263888888888889 | 269.49 |
| 0.6270833333333333 | 260.373 |
| 0.6277777777777778 | 255.813 |
| 0.6284722222222222 | 237.564 |
| 0.6291666666666667 | 214.746 |
| 0.6298611111111111 | 196.497 |
| 0.6305555555555555 | 182.82 |
| 0.63125 | 173.709 |
| 0.6319444444444444 | 164.605 |
| 0.6326388888888889 | 160.056 |
| 0.6333333333333333 | 155.509 |
| 0.6340277777777777 | 146.423 |
| 0.6347222222222222 | 137.347 |
| 0.6354166666666666 | 128.284 |
| 0.6361111111111112 | 119.235 |
| 0.6368055555555555 | 110.201 |
| 0.6375000000000001 | 101.184 |
| 0.6381944444444444 | 96.682 |
| 0.638888888888889 | 92.184 |
| 0.6395833333333333 | 83.205 |
| 0.6402777777777778 | 78.722 |
| 0.6409722222222222 | 74.246 |
| 0.6416666666666667 | 74.246 |
| 0.642361111111111 | 74.246 |
| 0.6430555555555556 | 69.775 |
| 0.6437499999999999 | 65.31 |
| 0.6444444444444445 | 65.31 |
| 0.6451388888888888 | 60.85 |
| 0.6458333333333334 | 56.398 |
| 0.6465277777777778 | 56.398 |
| 0.6472222222222223 | 56.398 |
| 0.6479166666666667 | 56.398 |
| 0.6486111111111111 | 56.398 |
| 0.6493055555555556 | 56.398 |
| 0.65 | 56.398 |
| 0.6506944444444445 | 51.951 |
| 0.6513888888888889 | 51.951 |
| 0.6520833333333333 | 51.951 |
| 0.6527777777777778 | 51.951 |
| 0.6534722222222222 | 51.951 |
| 0.6541666666666667 | 51.951 |
| 0.6548611111111111 | 51.951 |
| 0.6555555555555556 | 51.951 |
| 0.65625 | 47.511 |
| 0.6569444444444444 | 51.951 |
| 0.6576388888888889 | 56.398 |
| 0.6583333333333333 | 60.85 |
| 0.6590277777777778 | 65.31 |
| 0.6597222222222222 | 69.775 |
| 0.6604166666666667 | 69.775 |
| 0.6611111111111111 | 69.775 |
| 0.6618055555555555 | 69.775 |
| 0.6625 | 69.775 |
| 0.6631944444444444 | 74.246 |
| 0.6638888888888889 | 74.246 |
| 0.6645833333333333 | 74.246 |
| 0.6652777777777777 | 74.246 |
| 0.6659722222222222 | 83.205 |
| 0.6666666666666666 | 83.205 |
| 0.6673611111111111 | 87.692 |
| 0.6680555555555556 | 92.184 |
| 0.6687500000000001 | 92.184 |
| 0.6694444444444444 | 92.184 |
| 0.6701388888888888 | 92.184 |
| 0.6708333333333334 | 87.692 |
| 0.6715277777777778 | 87.692 |
| 0.6722222222222222 | 87.692 |
| 0.6729166666666666 | 87.692 |
| 0.6736111111111112 | 92.184 |
| 0.6743055555555556 | 92.184 |
| 0.6749999999999999 | 92.184 |
| 0.6756944444444444 | 92.184 |
| 0.6763888888888889 | 87.692 |
| 0.6770833333333334 | 83.205 |
| 0.6777777777777777 | 83.205 |
| 0.6784722222222223 | 78.722 |
| 0.6791666666666667 | 78.722 |
| 0.6798611111111111 | 78.722 |
| 0.6805555555555555 | 78.722 |
| 0.68125 | 83.205 |
| 0.6819444444444445 | 83.205 |
| 0.6826388888888889 | 87.692 |
| 0.6833333333333332 | 96.682 |
| 0.6840277777777778 | 101.184 |
| 0.6847222222222222 | 105.69 |
| 0.6854166666666667 | 105.69 |
| 0.686111111111111 | 101.184 |
| 0.6868055555555556 | 101.184 |
| 0.6875 | 96.682 |
| 0.6881944444444444 | 87.692 |
| 0.688888888888889 | 78.722 |
| 0.6895833333333333 | 74.246 |
| 0.6902777777777778 | 74.246 |
| 0.6909722222222222 | 74.246 |
| 0.6916666666666668 | 74.246 |
| 0.6923611111111111 | 78.722 |
| 0.6930555555555555 | 87.692 |
| 0.69375 | 96.682 |
| 0.6944444444444445 | 101.184 |
| 0.6951388888888889 | 105.69 |
| 0.6958333333333333 | 110.201 |
| 0.6965277777777777 | 110.201 |
| 0.6972222222222223 | 114.716 |
| 0.6979166666666666 | 119.235 |
| 0.6986111111111111 | 123.758 |
| 0.6993055555555556 | 119.235 |
| 0.7000000000000001 | 119.235 |
| 0.7006944444444444 | 119.235 |
| 0.7013888888888888 | 114.716 |
| 0.7020833333333334 | 105.69 |
| 0.7027777777777778 | 101.184 |
| 0.7034722222222222 | 96.682 |
| 0.7041666666666666 | 92.184 |
| 0.7048611111111112 | 87.692 |
| 0.7055555555555556 | 87.692 |
| 0.7062499999999999 | 87.692 |
| 0.7069444444444444 | 83.205 |
| 0.7076388888888889 | 83.205 |
| 0.7083333333333334 | 78.722 |
| 0.7090277777777777 | 78.722 |
| 0.7097222222222223 | 74.246 |
| 0.7104166666666667 | 74.246 |
| 0.7111111111111111 | 74.246 |
| 0.7118055555555555 | 74.246 |
| 0.7125 | 69.775 |
| 0.7131944444444445 | 65.31 |
| 0.7138888888888889 | 60.85 |
| 0.7145833333333332 | 60.85 |
| 0.7152777777777778 | 56.398 |
| 0.7159722222222222 | 56.398 |
| 0.7166666666666667 | 51.951 |
| 0.717361111111111 | 47.511 |
| 0.7180555555555556 | 47.511 |
| 0.71875 | 47.511 |
| 0.7194444444444444 | 47.511 |
| 0.720138888888889 | 47.511 |
| 0.7208333333333333 | 47.511 |
| 0.7215277777777778 | 47.511 |
| 0.7222222222222222 | 47.511 |
| 0.7229166666666668 | 43.079 |
| 0.7236111111111111 | 43.079 |
| 0.7243055555555555 | 43.079 |
| 0.725 | 43.079 |
| 0.7256944444444445 | 43.079 |
| 0.7263888888888889 | 43.079 |
| 0.7270833333333333 | 43.079 |
| 0.7277777777777777 | 47.511 |
| 0.7284722222222223 | 47.511 |
| 0.7291666666666666 | 47.511 |
| 0.7298611111111111 | 47.511 |
| 0.7305555555555556 | 43.079 |
| 0.7312500000000001 | 43.079 |
| 0.7319444444444444 | 43.079 |
| 0.7326388888888888 | 43.079 |
| 0.7333333333333334 | 43.079 |
| 0.7340277777777778 | 38.653 |
| 0.7347222222222222 | 38.653 |
| 0.7354166666666666 | 38.653 |
| 0.7361111111111112 | 38.653 |
| 0.7368055555555556 | 38.653 |
| 0.7374999999999999 | 34.234 |
| 0.7381944444444444 | 34.234 |
| 0.7388888888888889 | 34.234 |
| 0.7395833333333334 | 34.234 |
| 0.7402777777777777 | 34.234 |
| 0.7409722222222223 | 34.234 |
| 0.7416666666666667 | 34.234 |
| 0.7423611111111111 | 34.234 |
| 0.7430555555555555 | 34.234 |
| 0.74375 | 34.234 |
| 0.7444444444444445 | 34.234 |
| 0.7451388888888889 | 29.823 |
| 0.7458333333333332 | 29.823 |
| 0.7465277777777778 | 29.823 |
| 0.7472222222222222 | 29.823 |
| 0.7479166666666667 | 29.823 |
| 0.748611111111111 | 29.823 |
| 0.7493055555555556 | 29.823 |
| 0.75 | 29.823 |
| 0.7506944444444444 | 29.823 |
| 0.751388888888889 | 29.823 |
| 0.7520833333333333 | 29.823 |
| 0.7527777777777778 | 29.823 |
| 0.7534722222222222 | 25.419 |
| 0.7541666666666668 | 25.419 |
| 0.7548611111111111 | 25.419 |
| 0.7555555555555555 | 25.419 |
| 0.75625 | 25.419 |
| 0.7569444444444445 | 25.419 |
| 0.7576388888888889 | 21.024 |
| 0.7583333333333333 | 21.024 |
| 0.7590277777777777 | 21.024 |
| 0.7597222222222223 | 21.024 |
| 0.7604166666666666 | 21.024 |
| 0.7611111111111111 | 21.024 |
| 0.7618055555555556 | 21.024 |
| 0.7625000000000001 | 21.024 |
| 0.7631944444444444 | 21.024 |
| 0.7638888888888888 | 21.024 |
| 0.7645833333333334 | 21.024 |
| 0.7652777777777778 | 21.024 |
| 0.7659722222222222 | 16.636 |
| 0.7666666666666666 | 16.636 |
| 0.7673611111111112 | 16.636 |
| 0.7680555555555556 | 16.636 |
| 0.7687499999999999 | 16.636 |
| 0.7694444444444444 | 12.257 |
| 0.7701388888888889 | 12.257 |
| 0.7708333333333334 | 12.257 |
| 0.7715277777777777 | 12.257 |
| 0.7722222222222223 | 12.257 |
| 0.7729166666666667 | 12.257 |
| 0.7736111111111111 | 12.257 |
| 0.7743055555555555 | 12.257 |
| 0.775 | 12.257 |
| 0.7756944444444445 | 12.257 |
| 0.7763888888888889 | 7.887 |
| 0.7770833333333332 | 7.887 |
| 0.7777777777777778 | 7.887 |
| 0.7784722222222222 | 7.887 |
| 0.7791666666666667 | 7.887 |
| 0.779861111111111 | 7.887 |
| 0.7805555555555556 | 7.887 |
| 0.78125 | 3.525 |
| 0.7819444444444444 | 3.525 |
| 0.782638888888889 | 3.525 |
| 0.7833333333333333 | 3.525 |
| 0.7840277777777778 | 3.525 |
| 0.7847222222222222 | 3.525 |
| 0.7854166666666668 | 3.525 |
| 0.7861111111111111 | 3.525 |
| 0.7868055555555555 | 0 |
| 0.7875 | 3.525 |
| 0.7881944444444445 | 0 |
| 0.7888888888888889 | 0 |
| 0.7895833333333333 | 0 |
| 0.7902777777777777 | 0 |
| 0.7909722222222223 | 0 |
| 0.7916666666666666 | 0 |
| 0.7923611111111111 | 0 |
| 0.7930555555555556 | 0 |
| 0.7937500000000001 | 0 |
| 0.7944444444444444 | 0 |
| 0.7951388888888888 | 0 |
| 0.7958333333333334 | 0 |
| 0.7965277777777778 | 0 |
| 0.7972222222222222 | 0 |
| 0.7979166666666666 | 0 |
| 0.7986111111111112 | 0 |
| 0.7993055555555556 | 0 |
| 0.7999999999999999 | 0 |
| 0.8006944444444444 | 0 |
| 0.8013888888888889 | 0 |
| 0.8020833333333334 | 0 |
| 0.8027777777777777 | 0 |
| 0.8034722222222223 | 0 |
| 0.8041666666666667 | 0 |
| 0.8048611111111111 | 0 |
| 0.8055555555555555 | 0 |
| 0.80625 | 0 |
| 0.8069444444444445 | 0 |
| 0.8076388888888889 | 0 |
| 0.8083333333333332 | 0 |
| 0.8090277777777778 | 0 |
| 0.8097222222222222 | 0 |
| 0.8104166666666667 | 0 |
| 0.811111111111111 | 0 |
| 0.8118055555555556 | 0 |
| 0.8125 | 0 |
| 0.8131944444444444 | 0 |
| 0.813888888888889 | 0 |
| 0.8145833333333333 | 0 |
| 0.8152777777777778 | 0 |
| 0.8159722222222222 | 0 |
| 0.8166666666666668 | 0 |
| 0.8173611111111111 | 0 |
| 0.8180555555555555 | 0 |
| 0.81875 | 0 |
| 0.8194444444444445 | 0 |
| 0.8201388888888889 | 0 |
| 0.8208333333333333 | 0 |
| 0.8215277777777777 | 0 |
| 0.8222222222222223 | 0 |
| 0.8229166666666666 | 0 |
| 0.8236111111111111 | 0 |
| 0.8243055555555556 | 0 |
| 0.8250000000000001 | 0 |
| 0.8256944444444444 | 0 |
| 0.8263888888888888 | 0 |
| 0.8270833333333334 | 0 |
| 0.8277777777777778 | 0 |
| 0.8284722222222222 | 0 |
| 0.8291666666666666 | 0 |
| 0.8298611111111112 | 0 |
| 0.8305555555555556 | 0 |
| 0.8312499999999999 | 0 |
| 0.8319444444444444 | 0 |
| 0.8326388888888889 | 0 |
| 0.8333333333333334 | 0 |
| 0.8340277777777777 | 0 |
| 0.8347222222222223 | 0 |
| 0.8354166666666667 | 0 |
| 0.8361111111111111 | 0 |
| 0.8368055555555555 | 0 |
| 0.8375 | 0 |
| 0.8381944444444445 | 0 |
| 0.8388888888888889 | 0 |
| 0.8395833333333332 | 0 |
| 0.8402777777777778 | 0 |
| 0.8409722222222222 | 0 |
| 0.8416666666666667 | 0 |
| 0.842361111111111 | 0 |
| 0.8430555555555556 | 0 |
| 0.84375 | 0 |
| 0.8444444444444444 | 0 |
| 0.845138888888889 | 0 |
| 0.8458333333333333 | 0 |
| 0.8465277777777778 | 0 |
| 0.8472222222222222 | 0 |
| 0.8479166666666668 | 0 |
| 0.8486111111111111 | 0 |
| 0.8493055555555555 | 0 |
| 0.85 | 0 |
| 0.8506944444444445 | 0 |
| 0.8513888888888889 | 0 |
| 0.8520833333333333 | 0 |
| 0.8527777777777777 | 0 |
| 0.8534722222222223 | 0 |
| 0.8541666666666666 | 0 |
| 0.8548611111111111 | 0 |
| 0.8555555555555556 | 0 |
| 0.8562500000000001 | 0 |
| 0.8569444444444444 | 0 |
| 0.8576388888888888 | 0 |
| 0.8583333333333334 | 0 |
| 0.8590277777777778 | 0 |
| 0.8597222222222222 | 0 |
| 0.8604166666666666 | 0 |
| 0.8611111111111112 | 0 |
| 0.8618055555555556 | 0 |
| 0.8624999999999999 | 0 |
| 0.8631944444444444 | 0 |
| 0.8638888888888889 | 0 |
| 0.8645833333333334 | 0 |
| 0.8652777777777777 | 0 |
| 0.8659722222222223 | 0 |
| 0.8666666666666667 | 0 |
| 0.8673611111111111 | 0 |
| 0.8680555555555555 | 0 |
| 0.86875 | 0 |
| 0.8694444444444445 | 0 |
| 0.8701388888888889 | 0 |
| 0.8708333333333332 | 0 |
| 0.8715277777777778 | 0 |
| 0.8722222222222222 | 0 |
| 0.8729166666666667 | 0 |
| 0.873611111111111 | 0 |
| 0.8743055555555556 | 0 |
| 0.875 | 0 |
| 0.8756944444444444 | 0 |
| 0.876388888888889 | 0 |
| 0.8770833333333333 | 0 |
| 0.8777777777777778 | 0 |
| 0.8784722222222222 | 0 |
| 0.8791666666666668 | 0 |
| 0.8798611111111111 | 0 |
| 0.8805555555555555 | 0 |
| 0.88125 | 0 |
| 0.8819444444444445 | 0 |
| 0.8826388888888889 | 0 |
| 0.8833333333333333 | 0 |
| 0.8840277777777777 | 0 |
| 0.8847222222222223 | 0 |
| 0.8854166666666666 | 0 |
| 0.8861111111111111 | 0 |
| 0.8868055555555556 | 0 |
| 0.8875000000000001 | 0 |
| 0.8881944444444444 | 0 |
| 0.8888888888888888 | 0 |
| 0.8895833333333334 | 0 |
| 0.8902777777777778 | 0 |
| 0.8909722222222222 | 0 |
| 0.8916666666666666 | 0 |
| 0.8923611111111112 | 0 |
| 0.8930555555555556 | 0 |
| 0.8937499999999999 | 0 |
| 0.8944444444444444 | 0 |
| 0.8951388888888889 | 0 |
| 0.8958333333333334 | 0 |
| 0.8965277777777777 | 0 |
| 0.8972222222222223 | 0 |
| 0.8979166666666667 | 0 |
| 0.8986111111111111 | 0 |
| 0.8993055555555555 | 0 |
| 0.9 | 0 |
| 0.9006944444444445 | 0 |
| 0.9013888888888889 | 0 |
| 0.9020833333333332 | 0 |
| 0.9027777777777778 | 0 |
| 0.9034722222222222 | 0 |
| 0.9041666666666667 | 0 |
| 0.904861111111111 | 0 |
| 0.9055555555555556 | 0 |
| 0.90625 | 0 |
| 0.9069444444444444 | 0 |
| 0.907638888888889 | 0 |
| 0.9083333333333333 | 0 |
| 0.9090277777777778 | 0 |
| 0.9097222222222222 | 0 |
| 0.9104166666666668 | 0 |
| 0.9111111111111111 | 0 |
| 0.9118055555555555 | 0 |
| 0.9125 | 0 |
| 0.9131944444444445 | 0 |
| 0.9138888888888889 | 0 |
| 0.9145833333333333 | 0 |
| 0.9152777777777777 | 0 |
| 0.9159722222222223 | 0 |
| 0.9166666666666666 | 0 |
| 0.9173611111111111 | 0 |
| 0.9180555555555556 | 0 |
| 0.9187500000000001 | 0 |
| 0.9194444444444444 | 0 |
| 0.9201388888888888 | 0 |
| 0.9208333333333334 | 0 |
| 0.9215277777777778 | 0 |
| 0.9222222222222222 | 0 |
| 0.9229166666666666 | 0 |
| 0.9236111111111112 | 0 |
| 0.9243055555555556 | 0 |
| 0.9249999999999999 | 0 |
| 0.9256944444444444 | 0 |
| 0.9263888888888889 | 0 |
| 0.9270833333333334 | 0 |
| 0.9277777777777777 | 0 |
| 0.9284722222222223 | 0 |
| 0.9291666666666667 | 0 |
| 0.9298611111111111 | 0 |
| 0.9305555555555555 | 0 |
| 0.93125 | 0 |
| 0.9319444444444445 | 0 |
| 0.9326388888888889 | 0 |
| 0.9333333333333332 | 0 |
| 0.9340277777777778 | 0 |
| 0.9347222222222222 | 0 |
| 0.9354166666666667 | 0 |
| 0.936111111111111 | 0 |
| 0.9368055555555556 | 0 |
| 0.9375 | 0 |
| 0.9381944444444444 | 0 |
| 0.938888888888889 | 0 |
| 0.9395833333333333 | 0 |
| 0.9402777777777778 | 0 |
| 0.9409722222222222 | 0 |
| 0.9416666666666668 | 0 |
| 0.9423611111111111 | 0 |
| 0.9430555555555555 | 0 |
| 0.94375 | 0 |
| 0.9444444444444445 | 0 |
| 0.9451388888888889 | 0 |
| 0.9458333333333333 | 0 |
| 0.9465277777777777 | 0 |
| 0.9472222222222223 | 0 |
| 0.9479166666666666 | 0 |
| 0.9486111111111111 | 0 |
| 0.9493055555555556 | 0 |
| 0.9500000000000001 | 0 |
| 0.9506944444444444 | 0 |
| 0.9513888888888888 | 0 |
| 0.9520833333333334 | 0 |
| 0.9527777777777778 | 0 |
| 0.9534722222222222 | 0 |
| 0.9541666666666666 | 0 |
| 0.9548611111111112 | 0 |
| 0.9555555555555556 | 0 |
| 0.9562499999999999 | 0 |
| 0.9569444444444444 | 0 |
| 0.9576388888888889 | 0 |
| 0.9583333333333334 | 0 |
| 0.9590277777777777 | 0 |
| 0.9597222222222223 | 0 |
| 0.9604166666666667 | 0 |
| 0.9611111111111111 | 0 |
| 0.9618055555555555 | 0 |
| 0.9625 | 0 |
| 0.9631944444444445 | 0 |
| 0.9638888888888889 | 0 |
| 0.9645833333333332 | 0 |
| 0.9652777777777778 | 0 |
| 0.9659722222222222 | 0 |
| 0.9666666666666667 | 0 |
| 0.967361111111111 | 0 |
| 0.9680555555555556 | 0 |
| 0.96875 | 0 |
| 0.9694444444444444 | 0 |
| 0.970138888888889 | 0 |
| 0.9708333333333333 | 0 |
| 0.9715277777777778 | 0 |
| 0.9722222222222222 | 0 |
| 0.9729166666666668 | 0 |
| 0.9736111111111111 | 0 |
| 0.9743055555555555 | 0 |
| 0.975 | 0 |
| 0.9756944444444445 | 0 |
| 0.9763888888888889 | 0 |
| 0.9770833333333333 | 0 |
| 0.9777777777777777 | 0 |
| 0.9784722222222223 | 0 |
| 0.9791666666666666 | 0 |
| 0.9798611111111111 | 0 |
| 0.9805555555555556 | 0 |
| 0.9812500000000001 | 0 |
| 0.9819444444444444 | 0 |
| 0.9826388888888888 | 0 |
| 0.9833333333333334 | 0 |
| 0.9840277777777778 | 0 |
| 0.9847222222222222 | 0 |
| 0.9854166666666666 | 0 |
| 0.9861111111111112 | 0 |
| 0.9868055555555556 | 0 |
| 0.9874999999999999 | 0 |
| 0.9881944444444444 | 0 |
| 0.9888888888888889 | 0 |
| 0.9895833333333334 | 0 |
| 0.9902777777777777 | 0 |
| 0.9909722222222223 | 0 |
| 0.9916666666666667 | 0 |
| 0.9923611111111111 | 0 |
| 0.9930555555555555 | 0 |
| 0.99375 | 0 |
| 0.9944444444444445 | 0 |
| 0.9951388888888889 | 0 |
| 0.9958333333333332 | 0 |
| 0.9965277777777778 | 0 |
| 0.9972222222222222 | 0 |
| 0.9979166666666667 | 0 |
| 0.998611111111111 | 0 |
| 0.9993055555555556 | 0 |